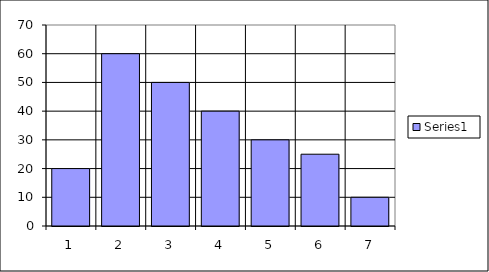
| Category | Series 0 |
|---|---|
| 0 | 20 |
| 1 | 60 |
| 2 | 50 |
| 3 | 40 |
| 4 | 30 |
| 5 | 25 |
| 6 | 10 |